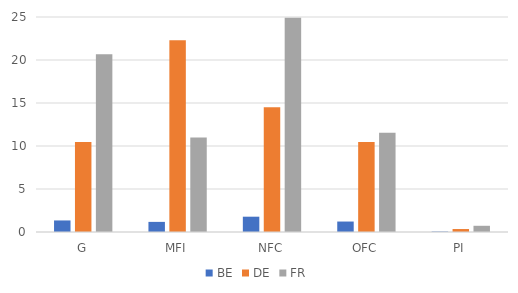
| Category | BE | DE | FR |
|---|---|---|---|
| G | 1.343 | 10.471 | 20.661 |
| MFI | 1.176 | 22.303 | 10.995 |
| NFC | 1.78 | 14.512 | 24.921 |
| OFC | 1.216 | 10.458 | 11.55 |
| PI | 0.048 | 0.345 | 0.722 |